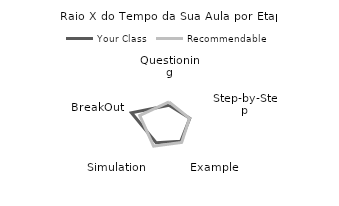
| Category | Your Class | Recommendable |
|---|---|---|
| Questioning | 0.044 | 0.15 |
| Step-by-Step | 0.111 | 0.1 |
| Example | 0.05 | 0.1 |
| Simulation | 0.111 | 0.25 |
| BreakOut | 0.683 | 0.4 |